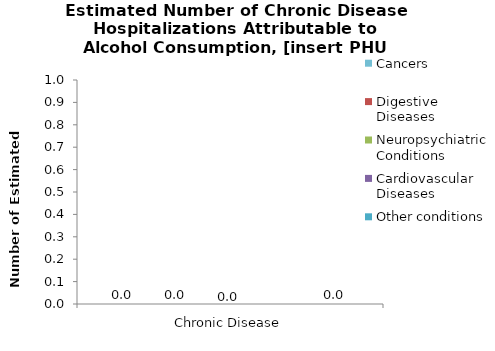
| Category | Cancers | Digestive Diseases | Neuropsychiatric Conditions | Cardiovascular Diseases | Other conditions |
|---|---|---|---|---|---|
| Chronic Disease | 0 | 0 | 0 | 0 | 0 |